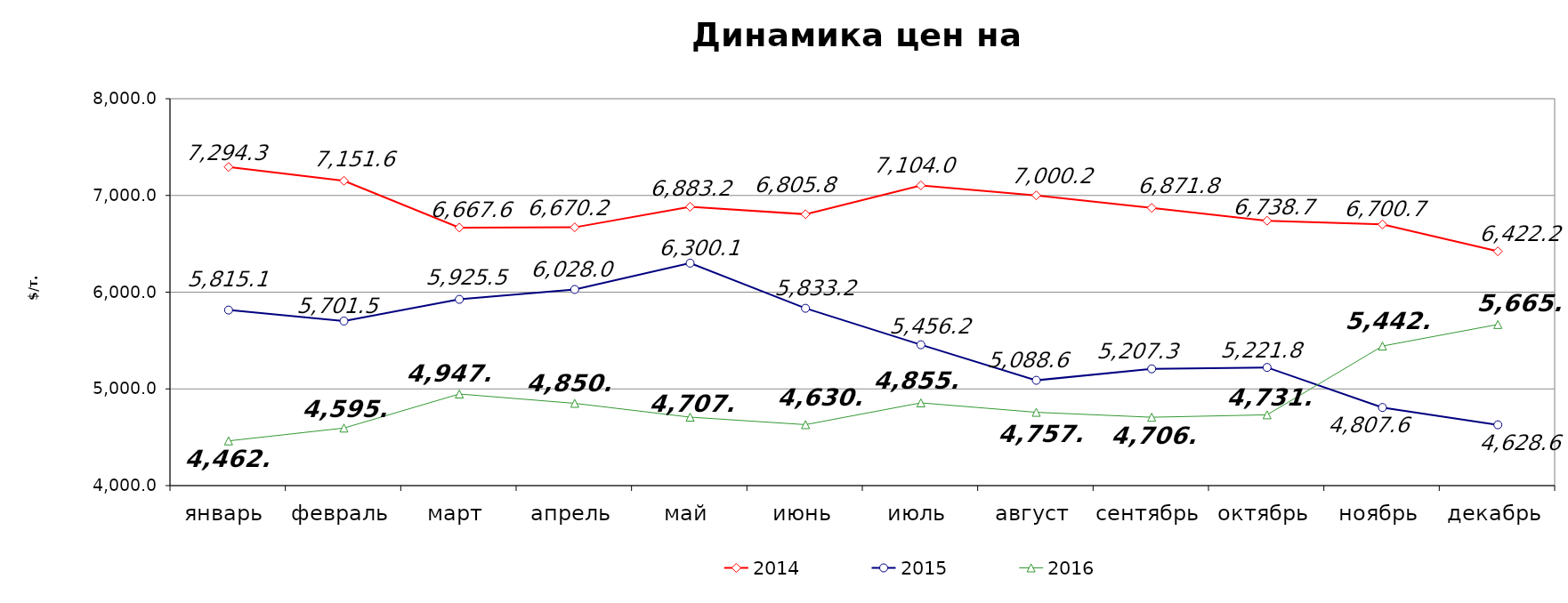
| Category | 2014 | 2015 | 2016 |
|---|---|---|---|
| январь | 7294.328 | 5815.07 | 4462.3 |
| февраль | 7151.58 | 5701.487 | 4594.96 |
| март | 6667.56 | 5925.455 | 4947.04 |
| апрель | 6670.24 | 6027.97 | 4850.55 |
| май | 6883.15 | 6300.078 | 4707.85 |
| июнь | 6805.8 | 5833.217 | 4630.27 |
| июль | 7104.02 | 5456.217 | 4855.358 |
| август | 7000.175 | 5088.56 | 4757.817 |
| сентябрь | 6871.829 | 5207.32 | 4706.786 |
| октябрь | 6738.73 | 5221.81 | 4731.761 |
| ноябрь | 6700.67 | 4807.629 | 5442.725 |
| декабрь | 6422.23 | 4628.595 | 5665.825 |